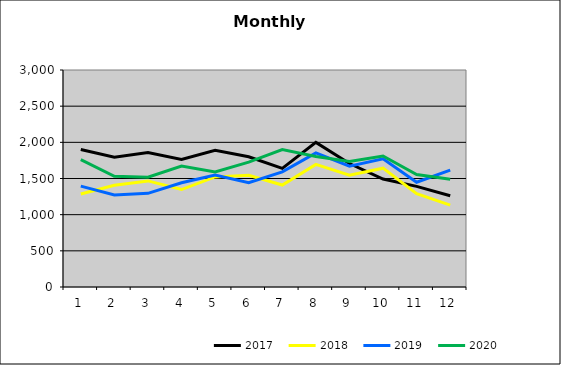
| Category | 2017 | 2018 | 2019 | 2020 |
|---|---|---|---|---|
| 0 | 1900.859 | 1286.21 | 1394.576 | 1762.064 |
| 1 | 1795.105 | 1406.556 | 1272.617 | 1530.829 |
| 2 | 1859.386 | 1466.695 | 1295.231 | 1518.163 |
| 3 | 1764.013 | 1347.408 | 1441.267 | 1671.58 |
| 4 | 1891.399 | 1522.181 | 1548.691 | 1589.128 |
| 5 | 1800.236 | 1543.945 | 1443.46 | 1725.706 |
| 6 | 1640.121 | 1409.491 | 1591.615 | 1898.774 |
| 7 | 1999.331 | 1694.901 | 1854.799 | 1803.166 |
| 8 | 1706.874 | 1545.104 | 1671.028 | 1735.175 |
| 9 | 1492.036 | 1642.816 | 1771.378 | 1810.413 |
| 10 | 1390.86 | 1288.934 | 1448.517 | 1553.864 |
| 11 | 1261.902 | 1131.485 | 1616.657 | 1488.683 |